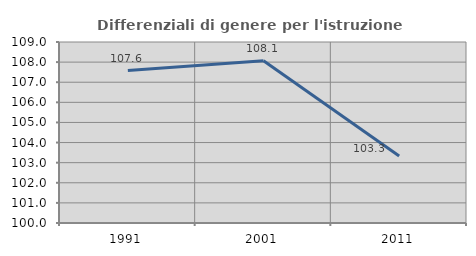
| Category | Differenziali di genere per l'istruzione superiore |
|---|---|
| 1991.0 | 107.581 |
| 2001.0 | 108.066 |
| 2011.0 | 103.336 |